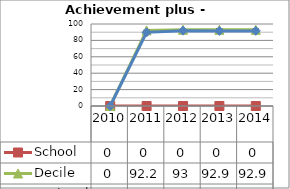
| Category | School  | Decile | National |
|---|---|---|---|
| 2010.0 | 0 | 0 | 0 |
| 2011.0 | 0 | 92.2 | 89.8 |
| 2012.0 | 0 | 93 | 91.9 |
| 2013.0 | 0 | 92.9 | 91.6 |
| 2014.0 | 0 | 92.9 | 91.6 |